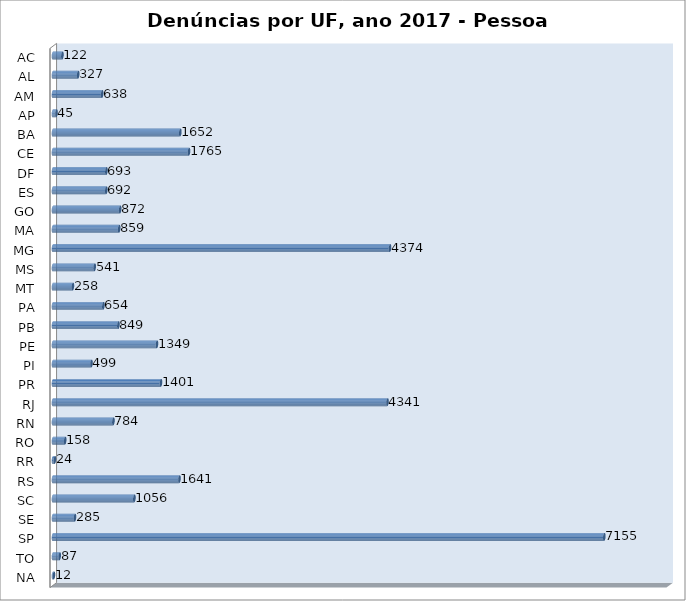
| Category | Series 0 |
|---|---|
| AC | 122 |
| AL | 327 |
| AM | 638 |
| AP | 45 |
| BA | 1652 |
| CE | 1765 |
| DF | 693 |
| ES | 692 |
| GO | 872 |
| MA | 859 |
| MG | 4374 |
| MS | 541 |
| MT | 258 |
| PA | 654 |
| PB | 849 |
| PE | 1349 |
| PI | 499 |
| PR | 1401 |
| RJ | 4341 |
| RN | 784 |
| RO | 158 |
| RR | 24 |
| RS | 1641 |
| SC | 1056 |
| SE | 285 |
| SP | 7155 |
| TO | 87 |
| NA | 12 |